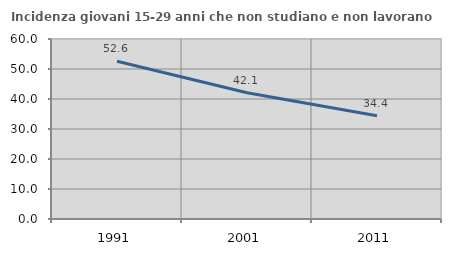
| Category | Incidenza giovani 15-29 anni che non studiano e non lavorano  |
|---|---|
| 1991.0 | 52.602 |
| 2001.0 | 42.073 |
| 2011.0 | 34.429 |